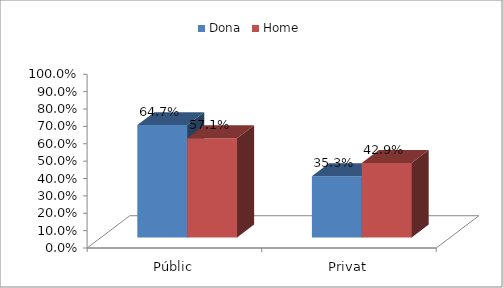
| Category | Dona | Home |
|---|---|---|
| Públic | 0.647 | 0.571 |
| Privat | 0.353 | 0.429 |